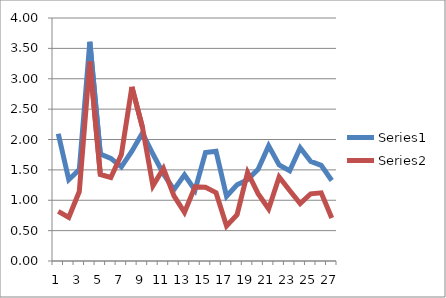
| Category | Series 0 | Series 1 |
|---|---|---|
| 0 | 2.095 | 0.816 |
| 1 | 1.338 | 0.718 |
| 2 | 1.504 | 1.143 |
| 3 | 3.607 | 3.283 |
| 4 | 1.762 | 1.424 |
| 5 | 1.69 | 1.375 |
| 6 | 1.55 | 1.752 |
| 7 | 1.808 | 2.868 |
| 8 | 2.107 | 2.205 |
| 9 | 1.761 | 1.239 |
| 10 | 1.434 | 1.524 |
| 11 | 1.175 | 1.071 |
| 12 | 1.419 | 0.8 |
| 13 | 1.167 | 1.22 |
| 14 | 1.787 | 1.214 |
| 15 | 1.808 | 1.126 |
| 16 | 1.066 | 0.578 |
| 17 | 1.253 | 0.763 |
| 18 | 1.339 | 1.457 |
| 19 | 1.51 | 1.109 |
| 20 | 1.895 | 0.858 |
| 21 | 1.581 | 1.384 |
| 22 | 1.486 | 1.161 |
| 23 | 1.864 | 0.944 |
| 24 | 1.639 | 1.106 |
| 25 | 1.574 | 1.122 |
| 26 | 1.325 | 0.708 |